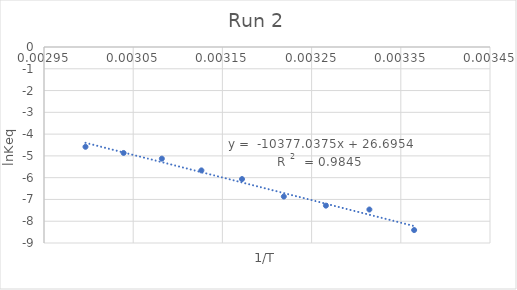
| Category | Series 0 |
|---|---|
| 0.003364963994885255 | -8.406 |
| 0.003314770617873243 | -7.463 |
| 0.0032660526487686982 | -7.285 |
| 0.0032188495831589788 | -6.867 |
| 0.003171985028230667 | -6.065 |
| 0.0031264655307175235 | -5.666 |
| 0.0030821390044691015 | -5.127 |
| 0.0030392365437802026 | -4.866 |
| 0.002996524032122737 | -4.582 |